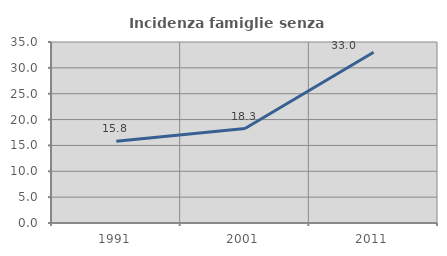
| Category | Incidenza famiglie senza nuclei |
|---|---|
| 1991.0 | 15.798 |
| 2001.0 | 18.269 |
| 2011.0 | 33.021 |